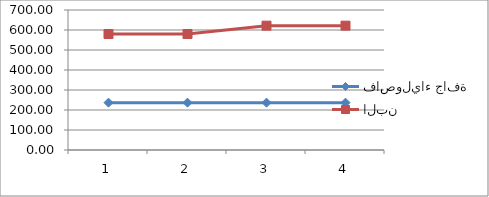
| Category | فاصولياء جافة | البن |
|---|---|---|
| 0 | 236.67 | 580 |
| 1 | 236.67 | 580 |
| 2 | 236.67 | 621.67 |
| 3 | 236.67 | 621.67 |